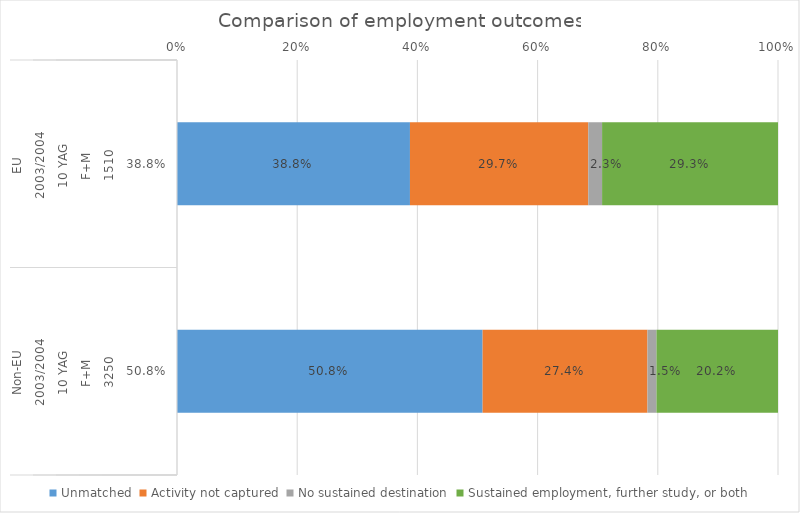
| Category | Unmatched | Activity not captured | No sustained destination | Sustained employment, further study, or both |
|---|---|---|---|---|
| 0 | 0.388 | 0.297 | 0.023 | 0.293 |
| 1 | 0.508 | 0.274 | 0.015 | 0.202 |